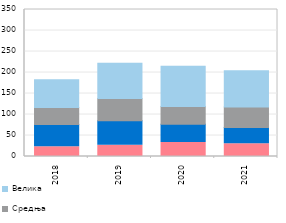
| Category | Микропредузећа | Мала | Средња | Велика |
|---|---|---|---|---|
| 2018-01-01 | 23.458 | 52.774 | 40.183 | 66.517 |
| nan | 25.544 | 54.802 | 52.603 | 77.229 |
| nan | 28.673 | 54.873 | 42.484 | 103.899 |
| nan | 37.41 | 70.984 | 51.038 | 152.215 |
| 2019-01-01 | 26.913 | 58.293 | 53.033 | 83.702 |
| nan | 35.763 | 61.475 | 78.723 | 111.897 |
| nan | 27.759 | 70.634 | 86.103 | 106.825 |
| nan | 44.489 | 62.561 | 59.132 | 108.665 |
| 2020-01-01 | 33.497 | 43.549 | 42.255 | 95.672 |
| nan | 32.961 | 54.332 | 59.003 | 72.028 |
| nan | 25.293 | 59.78 | 76.792 | 86.501 |
| nan | 37.626 | 49.063 | 68.305 | 103.2 |
| 2021-01-01 | 30.617 | 38.71 | 48.392 | 86.375 |